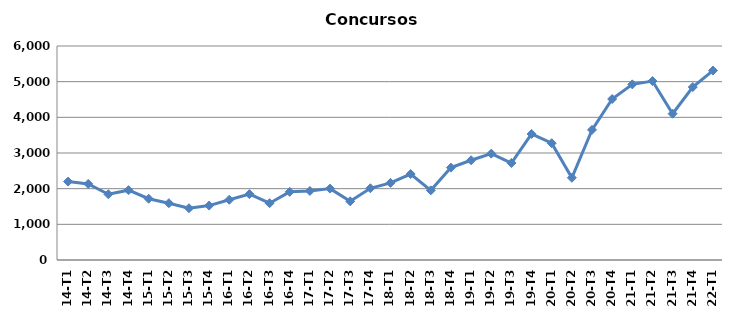
| Category | Concursos |
|---|---|
| 14-T1 | 2198 |
| 14-T2 | 2133 |
| 14-T3 | 1843 |
| 14-T4 | 1958 |
| 15-T1 | 1718 |
| 15-T2 | 1593 |
| 15-T3 | 1451 |
| 15-T4 | 1526 |
| 16-T1 | 1689 |
| 16-T2 | 1847 |
| 16-T3 | 1593 |
| 16-T4 | 1911 |
| 17-T1 | 1937 |
| 17-T2 | 2001 |
| 17-T3 | 1645 |
| 17-T4 | 2011 |
| 18-T1 | 2162 |
| 18-T2 | 2410 |
| 18-T3 | 1953 |
| 18-T4 | 2590 |
| 19-T1 | 2796 |
| 19-T2 | 2982 |
| 19-T3 | 2719 |
| 19-T4 | 3534 |
| 20-T1 | 3274 |
| 20-T2 | 2305 |
| 20-T3 | 3649 |
| 20-T4 | 4513 |
| 21-T1 | 4925 |
| 21-T2 | 5017 |
| 21-T3 | 4101 |
| 21-T4 | 4849 |
| 22-T1 | 5312 |